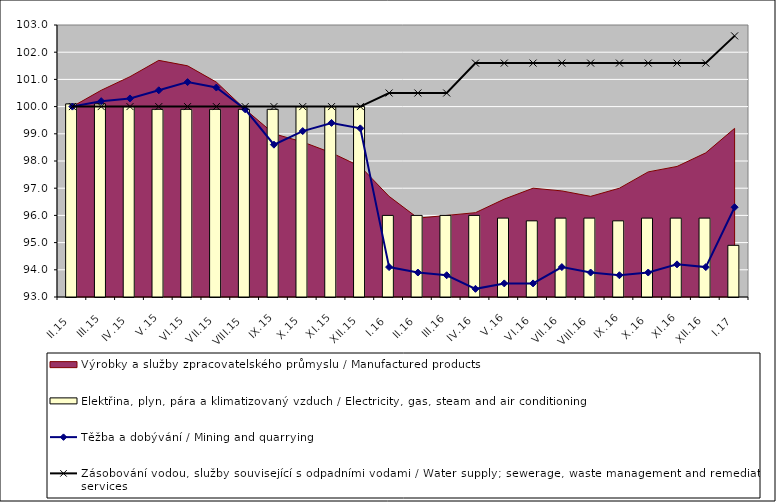
| Category | Elektřina, plyn, pára a klimatizovaný vzduch / Electricity, gas, steam and air conditioning |
|---|---|
| II.15 | 100.1 |
| III.15 | 100.1 |
| IV.15 | 100 |
| V.15 | 99.9 |
| VI.15 | 99.9 |
| VII.15 | 99.9 |
| VIII.15 | 99.9 |
| IX.15 | 99.9 |
| X.15 | 100 |
| XI.15 | 100 |
| XII.15 | 100 |
| I.16 | 96 |
| II.16 | 96 |
| III.16 | 96 |
| IV.16 | 96 |
| V.16 | 95.9 |
| VI.16 | 95.8 |
| VII.16 | 95.9 |
| VIII.16 | 95.9 |
| IX.16 | 95.8 |
| X.16 | 95.9 |
| XI.16 | 95.9 |
| XII.16 | 95.9 |
| I.17 | 94.9 |